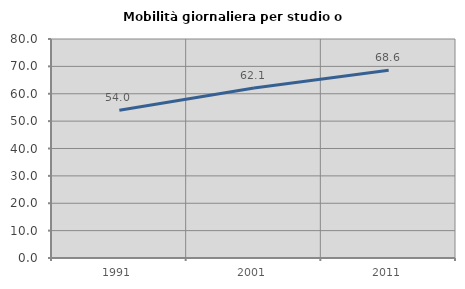
| Category | Mobilità giornaliera per studio o lavoro |
|---|---|
| 1991.0 | 53.981 |
| 2001.0 | 62.07 |
| 2011.0 | 68.569 |